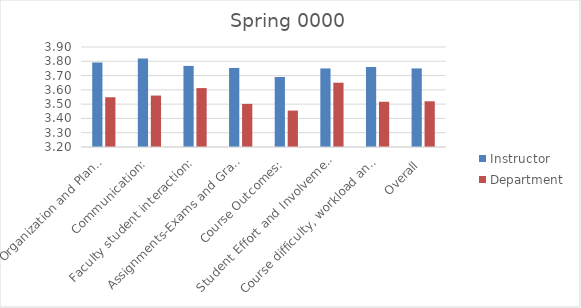
| Category | Instructor | Department |
|---|---|---|
| Course Organization and Planning: | 3.792 | 3.548 |
| Communication: | 3.82 | 3.56 |
| Faculty student interaction: | 3.768 | 3.612 |
| Assignments-Exams and Grading: | 3.753 | 3.502 |
| Course Outcomes: | 3.69 | 3.455 |
| Student Effort and Involvement: | 3.75 | 3.65 |
| Course difficulty, workload and Pace: | 3.76 | 3.517 |
| Overall | 3.75 | 3.52 |